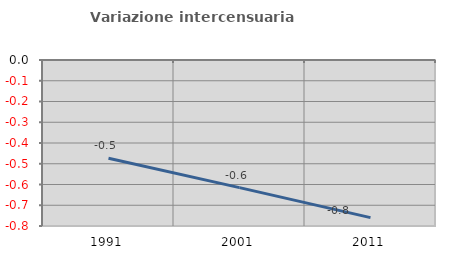
| Category | Variazione intercensuaria annua |
|---|---|
| 1991.0 | -0.473 |
| 2001.0 | -0.615 |
| 2011.0 | -0.76 |